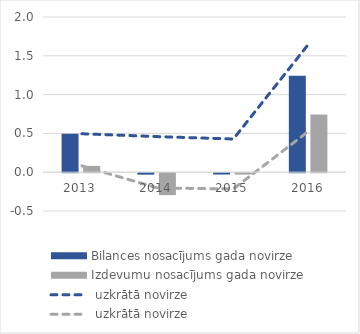
| Category | Bilances nosacījums | Izdevumu nosacījums |
|---|---|---|
| 2013.0 | 0.495 | 0.081 |
| 2014.0 | -0.019 | -0.282 |
| 2015.0 | -0.017 | -0.018 |
| 2016.0 | 1.243 | 0.743 |